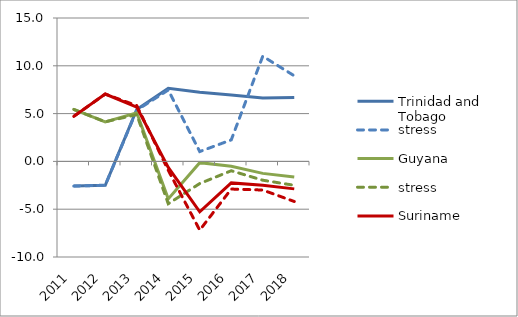
| Category | Trinidad and Tobago | stress | Guyana | Suriname |
|---|---|---|---|---|
| 2011.0 | -2.581 | 4.709 | 5.437 | 4.709 |
| 2012.0 | -2.49 | 7.047 | 4.14 | 7.047 |
| 2013.0 | 5.438 | 5.832 | 5.078 | 5.684 |
| 2014.0 | 7.647 | -0.926 | -3.919 | -0.625 |
| 2015.0 | 7.232 | -7.19 | -0.131 | -5.268 |
| 2016.0 | 6.943 | -2.892 | -0.509 | -2.248 |
| 2017.0 | 6.638 | -2.994 | -1.253 | -2.498 |
| 2018.0 | 6.695 | -4.193 | -1.641 | -2.875 |